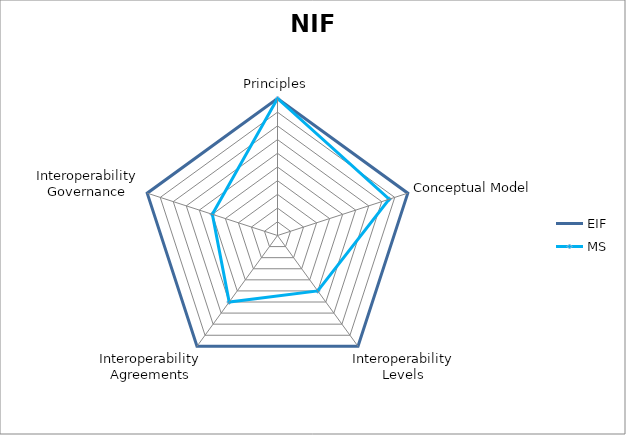
| Category | EIF | MS |
|---|---|---|
| Principles | 1 | 1 |
| Conceptual Model | 1 | 0.857 |
| Interoperability Levels | 1 | 0.5 |
| Interoperability Agreements | 1 | 0.6 |
| Interoperability Governance | 1 | 0.5 |